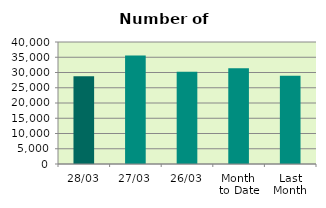
| Category | Series 0 |
|---|---|
| 28/03 | 28776 |
| 27/03 | 35554 |
| 26/03 | 30214 |
| Month 
to Date | 31415.1 |
| Last
Month | 28915.6 |